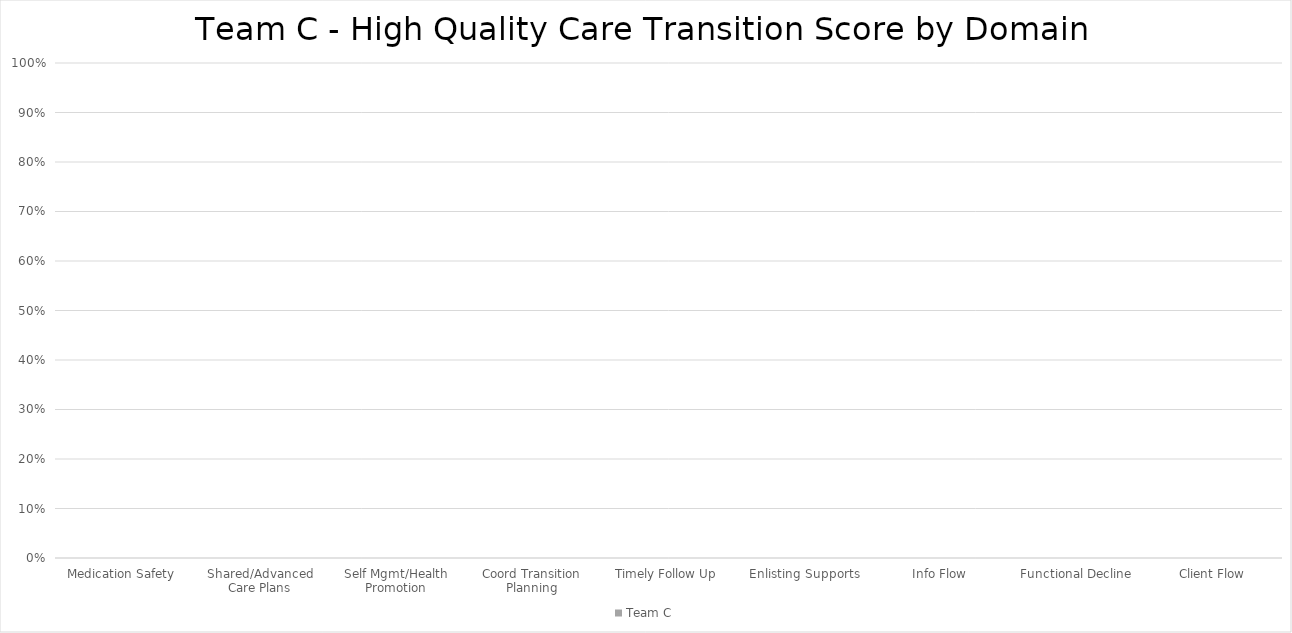
| Category | Team C |
|---|---|
| Medication Safety | 0 |
| Shared/Advanced Care Plans | 0 |
| Self Mgmt/Health Promotion | 0 |
| Coord Transition Planning | 0 |
| Timely Follow Up | 0 |
| Enlisting Supports | 0 |
| Info Flow | 0 |
| Functional Decline | 0 |
| Client Flow | 0 |